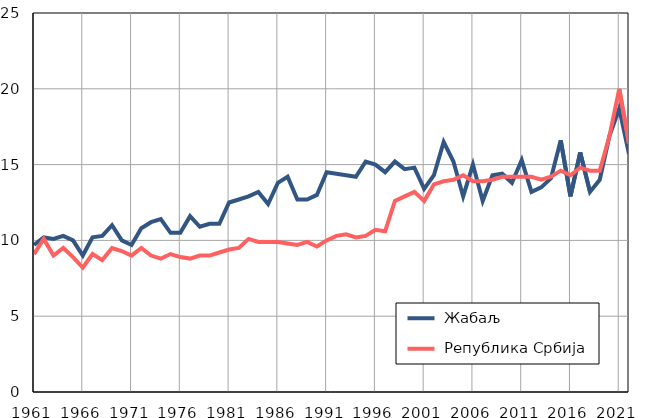
| Category |  Жабаљ |  Република Србија |
|---|---|---|
| 1961.0 | 9.7 | 9.1 |
| 1962.0 | 10.2 | 10.1 |
| 1963.0 | 10.1 | 9 |
| 1964.0 | 10.3 | 9.5 |
| 1965.0 | 10 | 8.9 |
| 1966.0 | 9 | 8.2 |
| 1967.0 | 10.2 | 9.1 |
| 1968.0 | 10.3 | 8.7 |
| 1969.0 | 11 | 9.5 |
| 1970.0 | 10 | 9.3 |
| 1971.0 | 9.7 | 9 |
| 1972.0 | 10.8 | 9.5 |
| 1973.0 | 11.2 | 9 |
| 1974.0 | 11.4 | 8.8 |
| 1975.0 | 10.5 | 9.1 |
| 1976.0 | 10.5 | 8.9 |
| 1977.0 | 11.6 | 8.8 |
| 1978.0 | 10.9 | 9 |
| 1979.0 | 11.1 | 9 |
| 1980.0 | 11.1 | 9.2 |
| 1981.0 | 12.5 | 9.4 |
| 1982.0 | 12.7 | 9.5 |
| 1983.0 | 12.9 | 10.1 |
| 1984.0 | 13.2 | 9.9 |
| 1985.0 | 12.4 | 9.9 |
| 1986.0 | 13.8 | 9.9 |
| 1987.0 | 14.2 | 9.8 |
| 1988.0 | 12.7 | 9.7 |
| 1989.0 | 12.7 | 9.9 |
| 1990.0 | 13 | 9.6 |
| 1991.0 | 14.5 | 10 |
| 1992.0 | 14.4 | 10.3 |
| 1993.0 | 14.3 | 10.4 |
| 1994.0 | 14.2 | 10.2 |
| 1995.0 | 15.2 | 10.3 |
| 1996.0 | 15 | 10.7 |
| 1997.0 | 14.5 | 10.6 |
| 1998.0 | 15.2 | 12.6 |
| 1999.0 | 14.7 | 12.9 |
| 2000.0 | 14.8 | 13.2 |
| 2001.0 | 13.4 | 12.6 |
| 2002.0 | 14.3 | 13.7 |
| 2003.0 | 16.5 | 13.9 |
| 2004.0 | 15.2 | 14 |
| 2005.0 | 12.9 | 14.3 |
| 2006.0 | 15 | 13.9 |
| 2007.0 | 12.6 | 13.9 |
| 2008.0 | 14.3 | 14 |
| 2009.0 | 14.4 | 14.2 |
| 2010.0 | 13.8 | 14.2 |
| 2011.0 | 15.3 | 14.2 |
| 2012.0 | 13.2 | 14.2 |
| 2013.0 | 13.5 | 14 |
| 2014.0 | 14.1 | 14.2 |
| 2015.0 | 16.6 | 14.6 |
| 2016.0 | 12.9 | 14.3 |
| 2017.0 | 15.8 | 14.8 |
| 2018.0 | 13.2 | 14.6 |
| 2019.0 | 14 | 14.6 |
| 2020.0 | 16.9 | 16.9 |
| 2021.0 | 18.7 | 20 |
| 2022.0 | 15.7 | 16.4 |